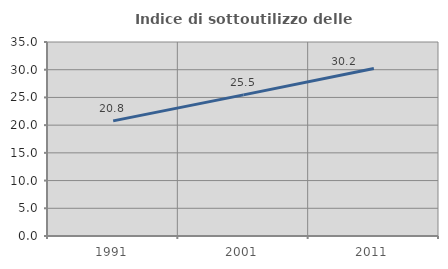
| Category | Indice di sottoutilizzo delle abitazioni  |
|---|---|
| 1991.0 | 20.77 |
| 2001.0 | 25.465 |
| 2011.0 | 30.231 |